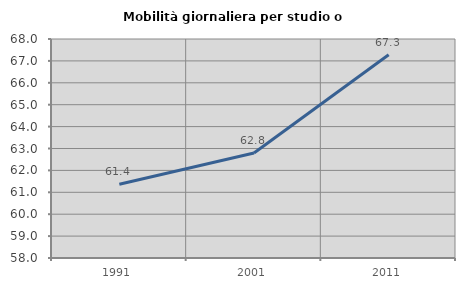
| Category | Mobilità giornaliera per studio o lavoro |
|---|---|
| 1991.0 | 61.369 |
| 2001.0 | 62.798 |
| 2011.0 | 67.281 |